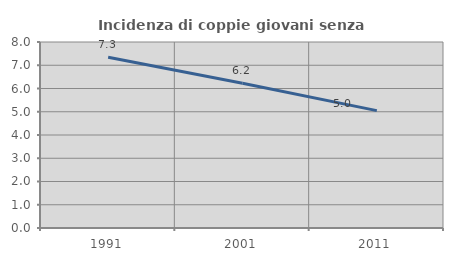
| Category | Incidenza di coppie giovani senza figli |
|---|---|
| 1991.0 | 7.341 |
| 2001.0 | 6.224 |
| 2011.0 | 5.049 |